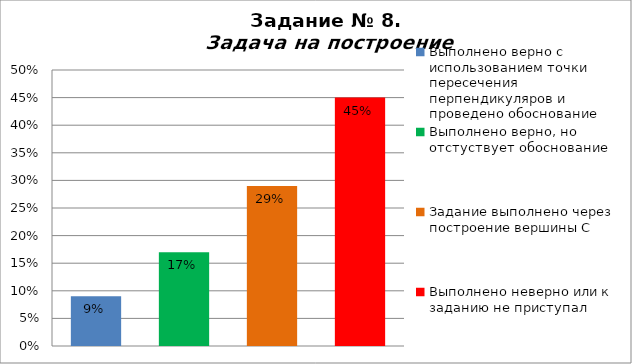
| Category | Задача на построение |
|---|---|
| Выполнено верно с использованием точки пересечения перпендикуляров и проведено обоснование | 0.09 |
| Выполнено верно, но отстуствует обоснование | 0.17 |
| Задание выполнено через построение вершины С | 0.29 |
| Выполнено неверно или к заданию не приступал | 0.45 |